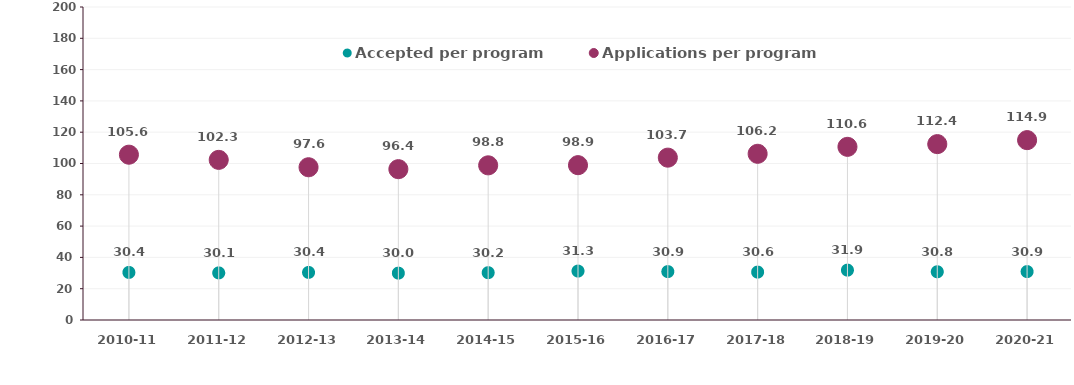
| Category | Accepted per program | Applications per program |
|---|---|---|
| 2010-11 | 30.406 | 105.625 |
| 2011-12 | 30.096 | 102.325 |
| 2012-13 | 30.403 | 97.603 |
| 2013-14 | 29.955 | 96.374 |
| 2014-15 | 30.236 | 98.827 |
| 2015-16 | 31.266 | 98.937 |
| 2016-17 | 30.93 | 103.739 |
| 2017-18 | 30.62 | 106.204 |
| 2018-19 | 31.865 | 110.649 |
| 2019-20 | 30.816 | 112.383 |
| 2020-21 | 30.927 | 114.937 |